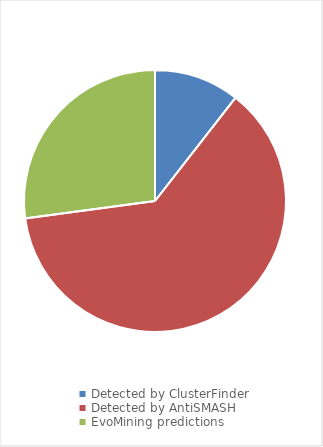
| Category | Series 0 |
|---|---|
| Detected by ClusterFinder | 47 |
| Detected by AntiSMASH | 278 |
| EvoMining predictions | 121 |